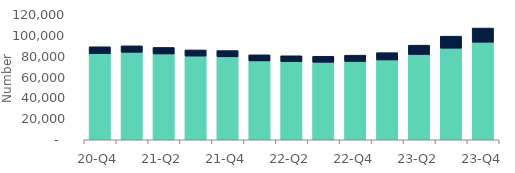
| Category | Homeowners | Buy-to-let |
|---|---|---|
| 20-Q4 | 82610 | 6700 |
| 21-Q1 | 84010 | 6180 |
| 21-Q2 | 82380 | 6260 |
| 21-Q3 | 80360 | 5880 |
| 21-Q4 | 79640 | 6010 |
| 22-Q1 | 75700 | 5870 |
| 22-Q2 | 75000 | 5640 |
| 22-Q3 | 74420 | 5760 |
| 22-Q4 | 75170 | 6060 |
| 23-Q1 | 76620 | 7020 |
| 23-Q2 | 81880 | 8960 |
| 23-Q3 | 87930 | 11540 |
| 23-Q4 | 93680 | 13570 |